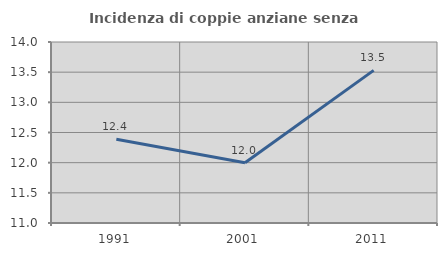
| Category | Incidenza di coppie anziane senza figli  |
|---|---|
| 1991.0 | 12.389 |
| 2001.0 | 12 |
| 2011.0 | 13.529 |